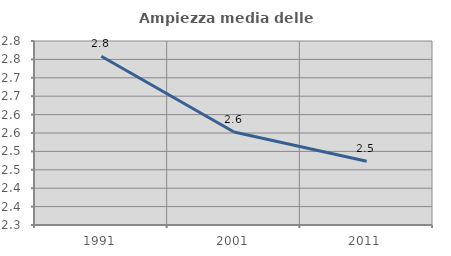
| Category | Ampiezza media delle famiglie |
|---|---|
| 1991.0 | 2.758 |
| 2001.0 | 2.553 |
| 2011.0 | 2.473 |